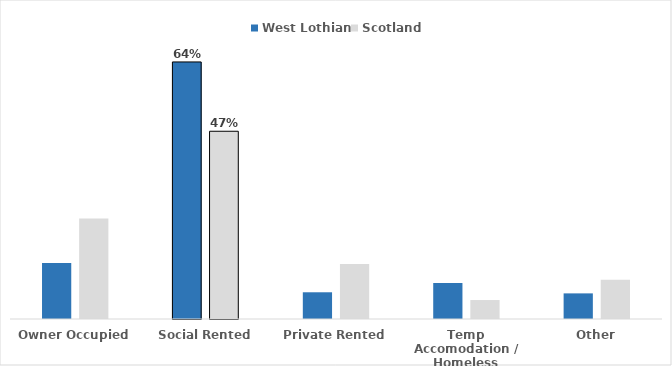
| Category | West Lothian | Scotland |
|---|---|---|
| Owner Occupied | 0.14 | 0.25 |
| Social Rented | 0.64 | 0.468 |
| Private Rented | 0.067 | 0.137 |
| Temp Accomodation / Homeless | 0.09 | 0.047 |
| Other | 0.064 | 0.098 |